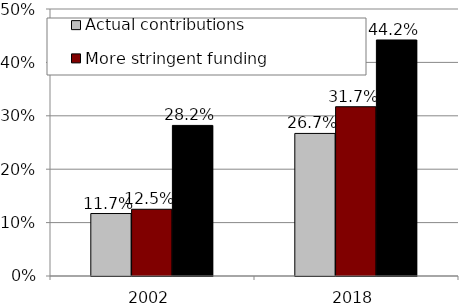
| Category | Actual contributions | More stringent funding | More stringent funding + lower assumed return |
|---|---|---|---|
| 2002.0 | 0.117 | 0.125 | 0.282 |
| 2018.0 | 0.267 | 0.317 | 0.442 |